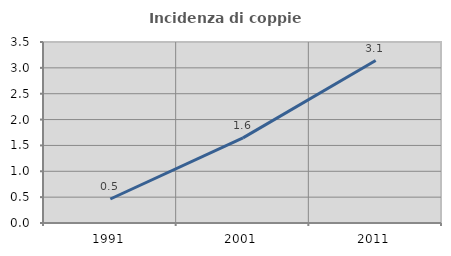
| Category | Incidenza di coppie miste |
|---|---|
| 1991.0 | 0.464 |
| 2001.0 | 1.646 |
| 2011.0 | 3.141 |